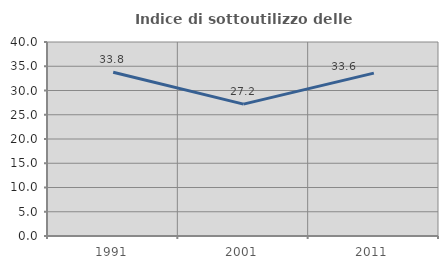
| Category | Indice di sottoutilizzo delle abitazioni  |
|---|---|
| 1991.0 | 33.766 |
| 2001.0 | 27.184 |
| 2011.0 | 33.588 |